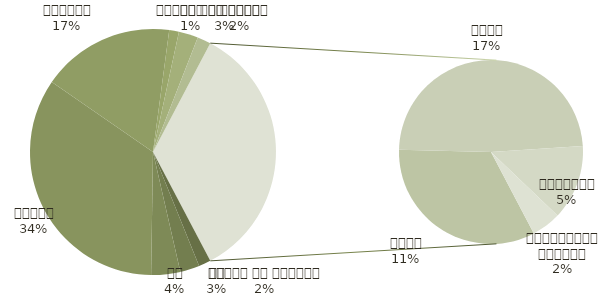
| Category | योग |
|---|---|
| उपहार और चैरिटी | 125 |
| ऋण | 200 |
| कर | 300 |
| घरेलू | 2702 |
| परिवहन | 1375 |
| पालतू जीव | 100 |
| बचत या निवेश | 200 |
| बच्चे | 140 |
| बीमा | 900 |
| भोजन | 1320 |
| मनोरंजन | 358 |
| व्यक्तिगत देखभाल | 140 |